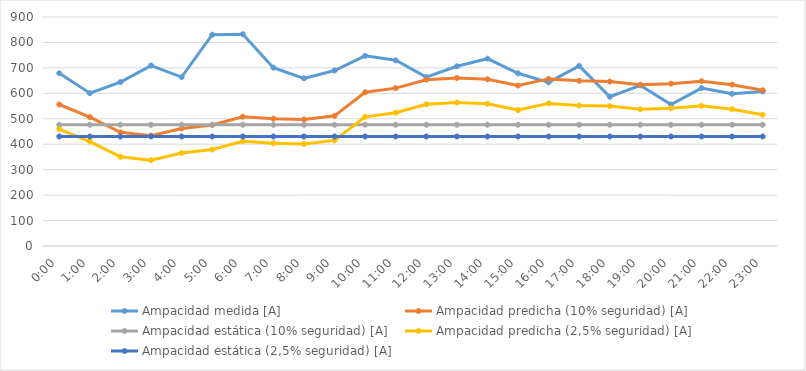
| Category | Ampacidad medida [A] | Ampacidad predicha (10% seguridad) [A] | Ampacidad estática (10% seguridad) [A] | Ampacidad predicha (2,5% seguridad) [A] | Ampacidad estática (2,5% seguridad) [A] |
|---|---|---|---|---|---|
| 0.0 | 678.809 | 556.081 | 476.5 | 459.648 | 430.4 |
| 0.041666666666666664 | 600.743 | 506.828 | 476.5 | 410.394 | 430.4 |
| 0.08333333333333333 | 644.088 | 446.878 | 476.5 | 350.444 | 430.4 |
| 0.125 | 709.167 | 433.821 | 476.5 | 337.387 | 430.4 |
| 0.166666666666667 | 663.968 | 461.765 | 476.5 | 365.331 | 430.4 |
| 0.208333333333333 | 830.296 | 475.474 | 476.5 | 379.04 | 430.4 |
| 0.25 | 832.517 | 508.091 | 476.5 | 411.657 | 430.4 |
| 0.291666666666667 | 700.947 | 500.203 | 476.5 | 403.769 | 430.4 |
| 0.333333333333333 | 658.763 | 497.386 | 476.5 | 400.952 | 430.4 |
| 0.375 | 689.802 | 511.553 | 476.5 | 415.119 | 430.4 |
| 0.416666666666667 | 747.21 | 604.08 | 476.5 | 507.646 | 430.4 |
| 0.458333333333333 | 729.859 | 620.426 | 476.5 | 523.992 | 430.4 |
| 0.5 | 663.695 | 653.516 | 476.5 | 557.083 | 430.4 |
| 0.541666666666667 | 706.461 | 660.341 | 476.5 | 563.907 | 430.4 |
| 0.583333333333333 | 736.082 | 655.435 | 476.5 | 559.002 | 430.4 |
| 0.625 | 678.685 | 630.697 | 476.5 | 534.264 | 430.4 |
| 0.666666666666667 | 643.222 | 656.736 | 476.5 | 560.303 | 430.4 |
| 0.708333333333333 | 708.117 | 649.04 | 476.5 | 552.606 | 430.4 |
| 0.75 | 586.455 | 646.186 | 476.5 | 549.752 | 430.4 |
| 0.791666666666667 | 631.098 | 633.579 | 476.5 | 537.146 | 430.4 |
| 0.833333333333333 | 556.056 | 637.901 | 476.5 | 541.467 | 430.4 |
| 0.875 | 620.593 | 647.452 | 476.5 | 551.018 | 430.4 |
| 0.916666666666667 | 598.152 | 634.111 | 476.5 | 537.677 | 430.4 |
| 0.958333333333333 | 607.488 | 612.146 | 476.5 | 515.712 | 430.4 |